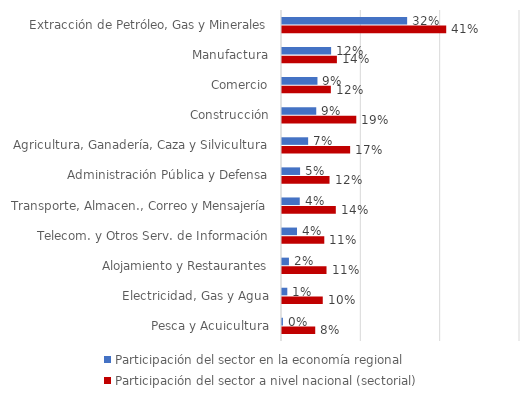
| Category | Participación del sector en la economía regional | Participación del sector a nivel nacional (sectorial) |
|---|---|---|
| Extracción de Petróleo, Gas y Minerales | 0.315 | 0.414 |
| Manufactura | 0.124 | 0.138 |
| Comercio | 0.089 | 0.123 |
| Construcción | 0.086 | 0.187 |
| Agricultura, Ganadería, Caza y Silvicultura | 0.066 | 0.172 |
| Administración Pública y Defensa | 0.046 | 0.12 |
| Transporte, Almacen., Correo y Mensajería | 0.045 | 0.136 |
| Telecom. y Otros Serv. de Información | 0.038 | 0.107 |
| Alojamiento y Restaurantes | 0.018 | 0.112 |
| Electricidad, Gas y Agua | 0.013 | 0.103 |
| Pesca y Acuicultura | 0.002 | 0.084 |